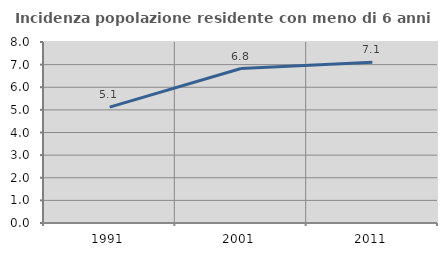
| Category | Incidenza popolazione residente con meno di 6 anni |
|---|---|
| 1991.0 | 5.124 |
| 2001.0 | 6.828 |
| 2011.0 | 7.1 |